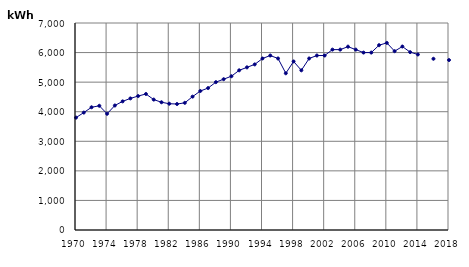
| Category | kWh |
|---|---|
| 1970.0 | 3800 |
| 1971.0 | 3970 |
| 1972.0 | 4150 |
| 1973.0 | 4200 |
| 1974.0 | 3930 |
| 1975.0 | 4210 |
| 1976.0 | 4350 |
| 1977.0 | 4450 |
| 1978.0 | 4530 |
| 1979.0 | 4600 |
| 1980.0 | 4410 |
| 1981.0 | 4320 |
| 1982.0 | 4270 |
| 1983.0 | 4260 |
| 1984.0 | 4300 |
| 1985.0 | 4510 |
| 1986.0 | 4700 |
| 1987.0 | 4800 |
| 1988.0 | 5000 |
| 1989.0 | 5100 |
| 1990.0 | 5200 |
| 1991.0 | 5400 |
| 1992.0 | 5500 |
| 1993.0 | 5600 |
| 1994.0 | 5800 |
| 1995.0 | 5900 |
| 1996.0 | 5800 |
| 1997.0 | 5300 |
| 1998.0 | 5700 |
| 1999.0 | 5400 |
| 2000.0 | 5800 |
| 2001.0 | 5900 |
| 2002.0 | 5900 |
| 2003.0 | 6100 |
| 2004.0 | 6100 |
| 2005.0 | 6200 |
| 2006.0 | 6100 |
| 2007.0 | 6000 |
| 2008.0 | 6000 |
| 2009.0 | 6249.909 |
| 2010.0 | 6326.873 |
| 2011.0 | 6047.482 |
| 2012.0 | 6204.612 |
| 2013.0 | 6014.448 |
| 2014.0 | 5935.345 |
| 2015.0 | 0 |
| 2016.0 | 5789.522 |
| 2017.0 | 0 |
| 2018.0 | 5746.621 |